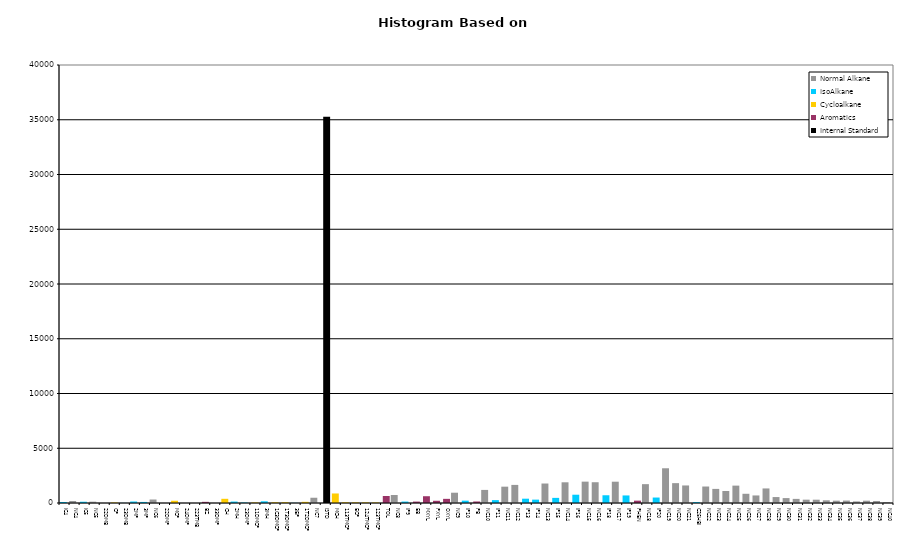
| Category | Normal Alkane | IsoAlkane | Cycloalkane | Aromatics | Internal Standard |
|---|---|---|---|---|---|
| IC4 | 0 | 92 | 0 | 0 | 0 |
| NC4 | 185 | 0 | 0 | 0 | 0 |
| IC5 | 0 | 115 | 0 | 0 | 0 |
| NC5 | 121 | 0 | 0 | 0 | 0 |
| 22DMB | 0 | 0 | 0 | 0 | 0 |
| CP | 0 | 0 | 45 | 0 | 0 |
| 23DMB | 0 | 10 | 0 | 0 | 0 |
| 2MP | 0 | 136 | 0 | 0 | 0 |
| 3MP | 0 | 97 | 0 | 0 | 0 |
| NC6 | 318 | 0 | 0 | 0 | 0 |
| 22DMP | 0 | 0 | 0 | 0 | 0 |
| MCP | 0 | 0 | 206 | 0 | 0 |
| 24DMP | 0 | 0 | 0 | 0 | 0 |
| 223TMB | 0 | 0 | 0 | 0 | 0 |
| BZ | 0 | 0 | 0 | 106 | 0 |
| 33DMP | 0 | 0 | 0 | 0 | 0 |
| CH | 0 | 0 | 383 | 0 | 0 |
| 2MH | 0 | 131 | 0 | 0 | 0 |
| 23DMP | 0 | 42 | 0 | 0 | 0 |
| 11DMCP | 0 | 0 | 50 | 0 | 0 |
| 3MH | 0 | 155 | 0 | 0 | 0 |
| 1C3DMCP | 0 | 0 | 67 | 0 | 0 |
| 1T3DMCP | 0 | 0 | 73 | 0 | 0 |
| 3EP | 0 | 12 | 0 | 0 | 0 |
| 1T2DMCP | 0 | 0 | 107 | 0 | 0 |
| NC7 | 480 | 0 | 0 | 0 | 0 |
| ISTD | 0 | 0 | 0 | 0 | 35265 |
| MCH | 0 | 0 | 870 | 0 | 0 |
| 113TMCP | 0 | 0 | 67 | 0 | 0 |
| ECP | 0 | 0 | 59 | 0 | 0 |
| 124TMCP | 0 | 0 | 56 | 0 | 0 |
| 123TMCP | 0 | 0 | 48 | 0 | 0 |
| TOL | 0 | 0 | 0 | 641 | 0 |
| NC8 | 732 | 0 | 0 | 0 | 0 |
| IP9 | 0 | 132 | 0 | 0 | 0 |
| EB | 0 | 0 | 0 | 130 | 0 |
| MXYL | 0 | 0 | 0 | 619 | 0 |
| PXYL | 0 | 0 | 0 | 203 | 0 |
| OXYL | 0 | 0 | 0 | 379 | 0 |
| NC9 | 939 | 0 | 0 | 0 | 0 |
| IP10 | 0 | 215 | 0 | 0 | 0 |
| PB | 0 | 0 | 0 | 139 | 0 |
| NC10 | 1195 | 0 | 0 | 0 | 0 |
| IP11 | 0 | 263 | 0 | 0 | 0 |
| NC11 | 1491 | 0 | 0 | 0 | 0 |
| NC12 | 1652 | 0 | 0 | 0 | 0 |
| IP13 | 0 | 393 | 0 | 0 | 0 |
| IP14 | 0 | 308 | 0 | 0 | 0 |
| NC13 | 1779 | 0 | 0 | 0 | 0 |
| IP15 | 0 | 468 | 0 | 0 | 0 |
| NC14 | 1891 | 0 | 0 | 0 | 0 |
| IP16 | 0 | 757 | 0 | 0 | 0 |
| NC15 | 1951 | 0 | 0 | 0 | 0 |
| NC16 | 1897 | 0 | 0 | 0 | 0 |
| IP18 | 0 | 707 | 0 | 0 | 0 |
| NC17 | 1946 | 0 | 0 | 0 | 0 |
| IP19 | 0 | 690 | 0 | 0 | 0 |
| PHEN | 0 | 0 | 0 | 215 | 0 |
| NC18 | 1721 | 0 | 0 | 0 | 0 |
| IP20 | 0 | 499 | 0 | 0 | 0 |
| NC19 | 3172 | 0 | 0 | 0 | 0 |
| NC20 | 1813 | 0 | 0 | 0 | 0 |
| NC21 | 1602 | 0 | 0 | 0 | 0 |
| C25HBI | 0 | 83 | 0 | 0 | 0 |
| NC22 | 1505 | 0 | 0 | 0 | 0 |
| NC23 | 1288 | 0 | 0 | 0 | 0 |
| NC24 | 1095 | 0 | 0 | 0 | 0 |
| NC25 | 1587 | 0 | 0 | 0 | 0 |
| NC26 | 842 | 0 | 0 | 0 | 0 |
| NC27 | 690 | 0 | 0 | 0 | 0 |
| NC28 | 1330 | 0 | 0 | 0 | 0 |
| NC29 | 543 | 0 | 0 | 0 | 0 |
| NC30 | 449 | 0 | 0 | 0 | 0 |
| NC31 | 376 | 0 | 0 | 0 | 0 |
| NC32 | 304 | 0 | 0 | 0 | 0 |
| NC33 | 302 | 0 | 0 | 0 | 0 |
| NC34 | 246 | 0 | 0 | 0 | 0 |
| NC35 | 213 | 0 | 0 | 0 | 0 |
| NC36 | 223 | 0 | 0 | 0 | 0 |
| NC37 | 146 | 0 | 0 | 0 | 0 |
| NC38 | 210 | 0 | 0 | 0 | 0 |
| NC39 | 181 | 0 | 0 | 0 | 0 |
| NC40 | 88 | 0 | 0 | 0 | 0 |